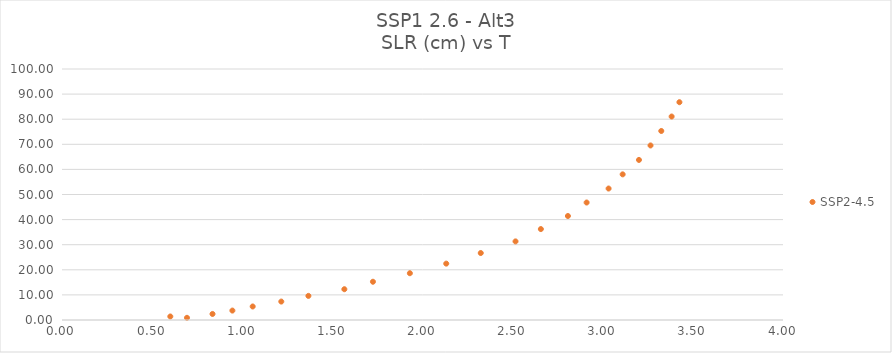
| Category | SSP2-4.5 |
|---|---|
| 0.693400617 | 0.87 |
| 0.600872844 | 1.399 |
| 0.835003234 | 2.407 |
| 0.945258389 | 3.755 |
| 1.057970477 | 5.386 |
| 1.216609042 | 7.344 |
| 1.366998793 | 9.606 |
| 1.566434093 | 12.264 |
| 1.725091817 | 15.242 |
| 1.929929564 | 18.639 |
| 2.131678938 | 22.458 |
| 2.323168738 | 26.682 |
| 2.516093338 | 31.317 |
| 2.656643405 | 36.229 |
| 2.806702479 | 41.435 |
| 2.910577111 | 46.805 |
| 3.032434446 | 52.378 |
| 3.110482519 | 58.025 |
| 3.200898844 | 63.772 |
| 3.265075487 | 69.539 |
| 3.324765387 | 75.307 |
| 3.382231307 | 81.066 |
| 3.425341542 | 86.773 |